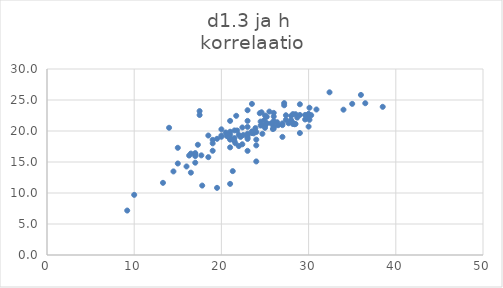
| Category | korrelaatio |
|---|---|
| 20.0 | 19.07 |
| 28.0 | 21.76 |
| 23.0 | 20.66 |
| 30.0 | 22.37 |
| 27.0 | 19.05 |
| 21.0 | 18.84 |
| 24.0 | 18.61 |
| 21.0 | 19.88 |
| 30.0 | 20.71 |
| 17.0 | 16.43 |
| 21.0 | 11.47 |
| 23.0 | 21.63 |
| 36.0 | 25.82 |
| 29.0 | 22.59 |
| 26.0 | 22.92 |
| 23.0 | 23.35 |
| 26.5 | 20.93 |
| 19.0 | 16.81 |
| 18.5 | 15.78 |
| 23.0 | 19.34 |
| 24.0 | 15.09 |
| 14.0 | 20.52 |
| 21.5 | 18.34 |
| 19.5 | 10.83 |
| 16.5 | 13.28 |
| 20.5 | 19.76 |
| 24.0 | 19.83 |
| 28.0 | 22.45 |
| 26.0 | 22.33 |
| 23.0 | 19.58 |
| 21.0 | 19.41 |
| 14.5 | 13.48 |
| 24.5 | 20.88 |
| 27.0 | 20.95 |
| 22.0 | 17.57 |
| 26.0 | 21.61 |
| 23.0 | 18.97 |
| 23.5 | 19.94 |
| 25.0 | 22.5 |
| 36.5 | 24.48 |
| 25.5 | 23.13 |
| 17.5 | 22.58 |
| 17.5 | 23.21 |
| 23.0 | 16.8 |
| 19.0 | 18.57 |
| 26.0 | 20.69 |
| 21.5 | 18.86 |
| 10.0 | 9.7 |
| 21.0 | 17.36 |
| 21.0 | 21.63 |
| 23.5 | 24.37 |
| 25.0 | 20.97 |
| 28.5 | 22.71 |
| 19.5 | 18.74 |
| 29.0 | 24.31 |
| 23.5 | 19.66 |
| 16.5 | 16.36 |
| 15.0 | 14.76 |
| 30.0 | 22.69 |
| 18.5 | 19.27 |
| 21.5 | 20.09 |
| 80.0 | 12.16 |
| 23.7 | 19.62 |
| 24.4 | 22.87 |
| 20.6 | 19.22 |
| 21.7 | 22.45 |
| 28.4 | 21.09 |
| 25.2 | 21.28 |
| 15.0 | 17.29 |
| 22.2 | 19.05 |
| 25.7 | 21.23 |
| 22.5 | 19.35 |
| 22.4 | 17.86 |
| 29.6 | 21.86 |
| 25.0 | 20.51 |
| 27.4 | 22.54 |
| 28.2 | 22.72 |
| 27.4 | 21.81 |
| 30.3 | 22.55 |
| 25.9 | 20.32 |
| 30.1 | 23.75 |
| 21.3 | 13.53 |
| 28.7 | 22.16 |
| 24.6 | 20.98 |
| 28.2 | 21.13 |
| 23.0 | 18.72 |
| 35.0 | 24.38 |
| 17.7 | 16.07 |
| 17.0 | 14.89 |
| 16.3 | 16.04 |
| 30.9 | 23.47 |
| 30.1 | 21.81 |
| 30.0 | 22.46 |
| 20.8 | 19.04 |
| 21.6 | 18.02 |
| 27.0 | 21.23 |
| 23.9 | 20.47 |
| 17.0 | 16.32 |
| 16.0 | 14.28 |
| 19.0 | 18.01 |
| 29.0 | 19.67 |
| 24.7 | 19.55 |
| 29.6 | 22.59 |
| 9.2 | 7.17 |
| 17.8 | 11.2 |
| 26.0 | 20.7 |
| 21.8 | 20.08 |
| 17.0 | 15.96 |
| 20.0 | 19.26 |
| 22.4 | 20.57 |
| 24.6 | 23.02 |
| 28.3 | 21.25 |
| 20.0 | 20.27 |
| 34.0 | 23.44 |
| 24.9 | 21.71 |
| 24.5 | 21.52 |
| 22.0 | 19.38 |
| 17.3 | 17.78 |
| 26.0 | 21.35 |
| 25.2 | 22.29 |
| 24.0 | 17.68 |
| 38.5 | 23.9 |
| 32.4 | 26.24 |
| 26.0 | 20.39 |
| 21.0 | 18.61 |
| 27.7 | 21.25 |
| 25.1 | 21.04 |
| 26.4 | 21.41 |
| 27.2 | 24.15 |
| 27.2 | 24.5 |
| 30.0 | 22.76 |
| 28.5 | 21.14 |
| 13.3 | 11.64 |